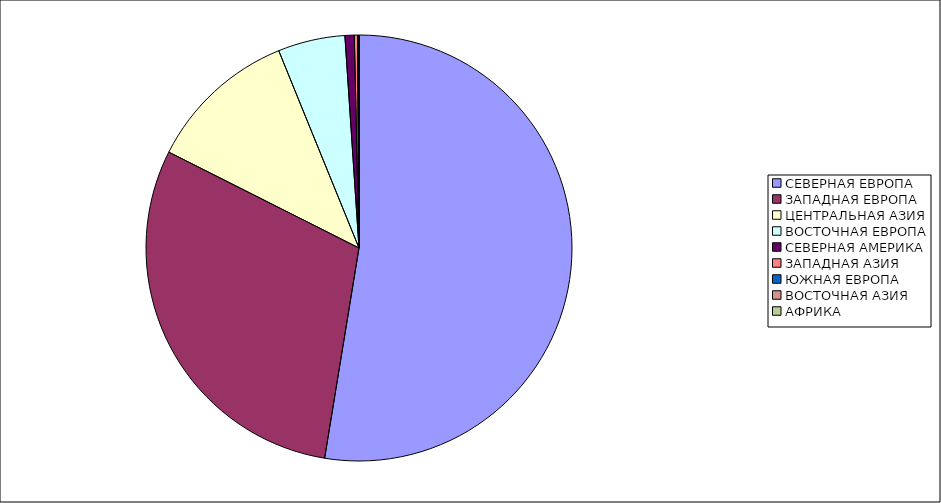
| Category | Оборот |
|---|---|
| СЕВЕРНАЯ ЕВРОПА | 52.581 |
| ЗАПАДНАЯ ЕВРОПА | 29.852 |
| ЦЕНТРАЛЬНАЯ АЗИЯ | 11.417 |
| ВОСТОЧНАЯ ЕВРОПА | 5.093 |
| СЕВЕРНАЯ АМЕРИКА | 0.704 |
| ЗАПАДНАЯ АЗИЯ | 0.239 |
| ЮЖНАЯ ЕВРОПА | 0.088 |
| ВОСТОЧНАЯ АЗИЯ | 0.025 |
| АФРИКА | 0.001 |